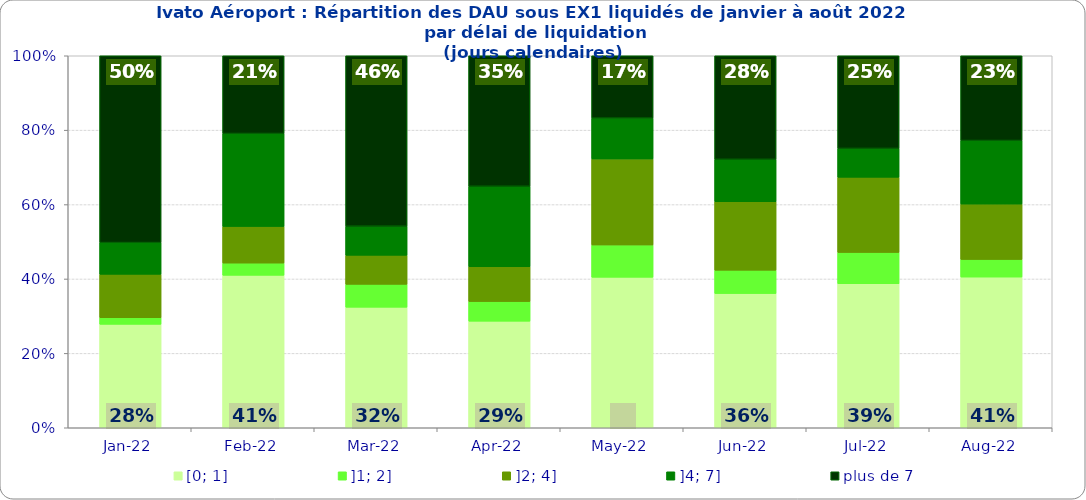
| Category | [0; 1] | ]1; 2] | ]2; 4] | ]4; 7] | plus de 7 |
|---|---|---|---|---|---|
| 2022-01-01 | 0.278 | 0.018 | 0.117 | 0.085 | 0.502 |
| 2022-02-01 | 0.41 | 0.033 | 0.098 | 0.25 | 0.209 |
| 2022-03-01 | 0.324 | 0.061 | 0.078 | 0.078 | 0.458 |
| 2022-04-01 | 0.287 | 0.053 | 0.094 | 0.216 | 0.351 |
| 2022-05-01 | 0.405 | 0.087 | 0.231 | 0.11 | 0.168 |
| 2022-06-01 | 0.361 | 0.063 | 0.184 | 0.114 | 0.278 |
| 2022-07-01 | 0.387 | 0.084 | 0.202 | 0.077 | 0.249 |
| 2022-08-01 | 0.405 | 0.047 | 0.149 | 0.171 | 0.228 |